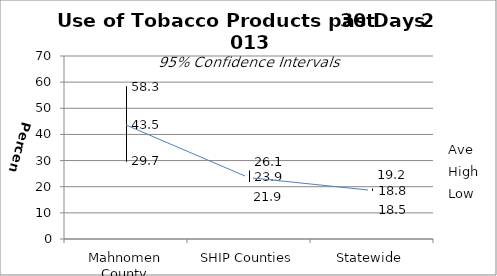
| Category | Ave | High | Low |
|---|---|---|---|
| Mahnomen County | 43.5 | 58.3 | 29.7 |
| SHIP Counties | 23.9 | 26.1 | 21.9 |
| Statewide | 18.8 | 19.2 | 18.5 |